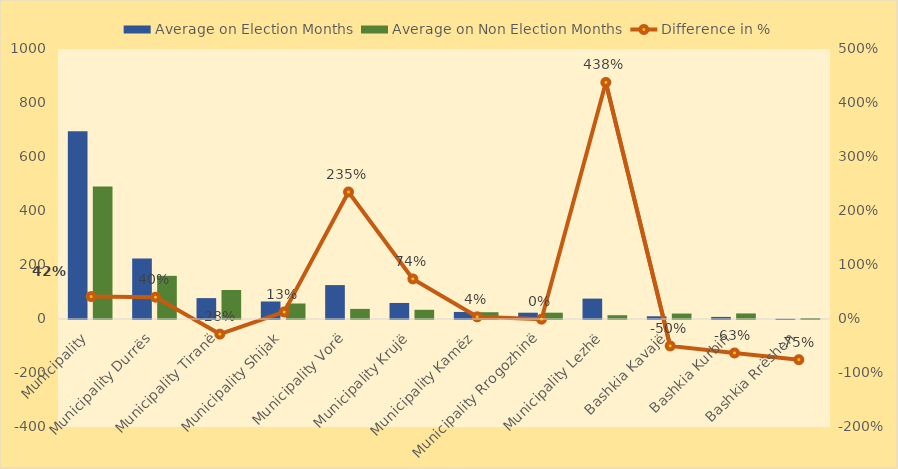
| Category | Average on Election Months | Average on Non Election Months |
|---|---|---|
| Municipality | 695.501 | 491.096 |
| Municipality Durrës | 224.52 | 159.885 |
| Municipality Tiranë | 77.421 | 107.494 |
| Municipality Shijak | 64.91 | 57.422 |
| Municipality Vorë | 125.625 | 37.476 |
| Municipality Krujë | 59.441 | 34.107 |
| Municipality Kamëz | 26.14 | 25.112 |
| Municipality Rrogozhinë | 23.3 | 23.376 |
| Municipality Lezhë | 75.522 | 14.036 |
| Bashkia Kavajë | 10.134 | 20.207 |
| Bashkia Kurbin | 7.651 | 20.618 |
| Bashkia Rrëshen | 0.924 | 3.751 |